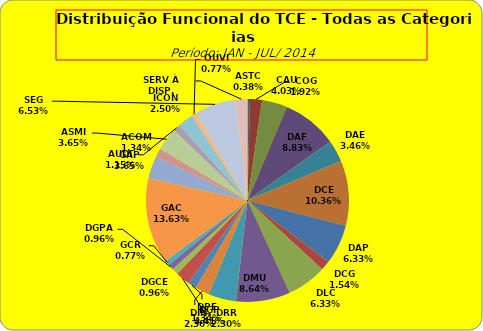
| Category | ASTC COG CAU DAF DAE DCE DAP DCG DLC DMU DGP DIN DPE DRR DGCE DGPA GCR GAC GAP ACOM ASMI AUDI ICON OUVI SEG SERV À DISP. |
|---|---|
| ASTC | 2 |
| COG | 10 |
| CAU | 21 |
| DAF | 46 |
| DAE | 18 |
| DCE | 54 |
| DAP | 33 |
| DCG | 8 |
| DLC | 33 |
| DMU | 45 |
| DGP | 23 |
| DIN | 12 |
| DPE | 7 |
| DRR | 12 |
| DGCE | 5 |
| DGPA | 5 |
| GCR | 4 |
| GAC | 71 |
| GAP | 19 |
| ACOM | 7 |
| ASMI | 19 |
| AUDI | 6 |
| ICON | 13 |
| OUVI | 4 |
| SEG | 34 |
| SERV À DISP. | 10 |